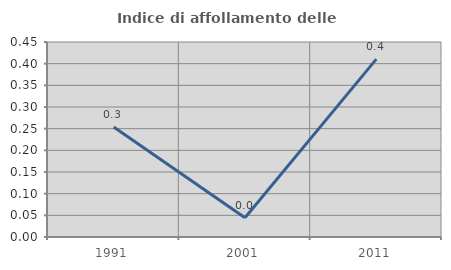
| Category | Indice di affollamento delle abitazioni  |
|---|---|
| 1991.0 | 0.254 |
| 2001.0 | 0.045 |
| 2011.0 | 0.411 |